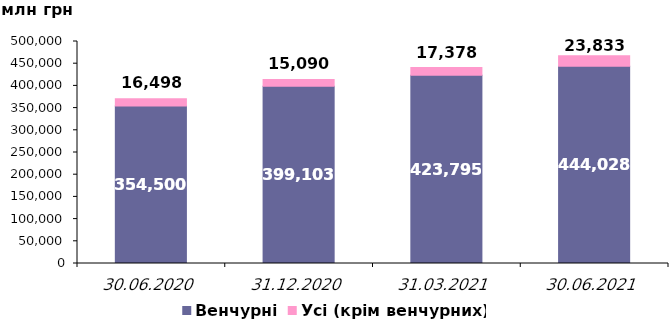
| Category | Венчурні | Усі (крім венчурних) |
|---|---|---|
| 30.06.2020 | 354500.307 | 16497.816 |
| 31.12.2020 | 399103.175 | 15089.679 |
| 31.03.2021 | 423794.786 | 17377.523 |
| 30.06.2021 | 444027.692 | 23832.89 |